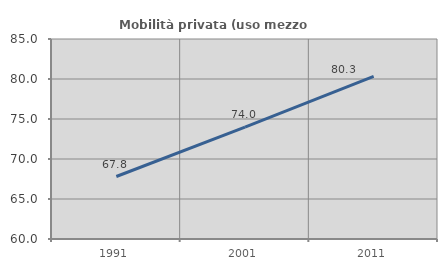
| Category | Mobilità privata (uso mezzo privato) |
|---|---|
| 1991.0 | 67.81 |
| 2001.0 | 73.991 |
| 2011.0 | 80.328 |